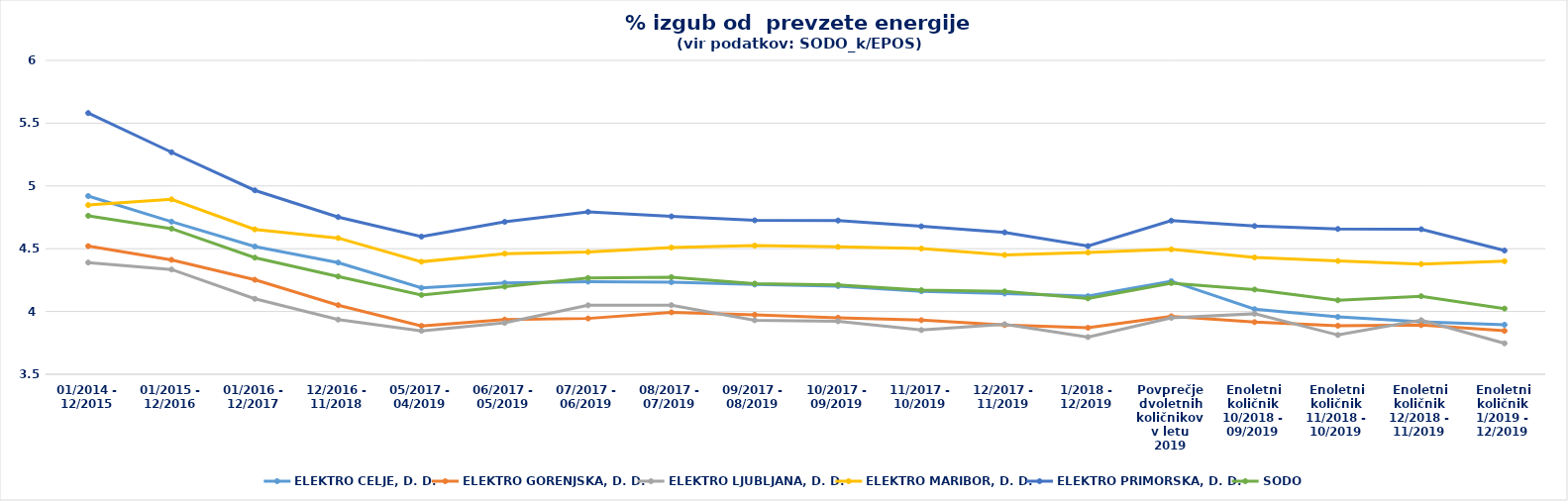
| Category | ELEKTRO CELJE, D. D. | ELEKTRO GORENJSKA, D. D. | ELEKTRO LJUBLJANA, D. D. | ELEKTRO MARIBOR, D. D. | ELEKTRO PRIMORSKA, D. D. | SODO |
|---|---|---|---|---|---|---|
| 01/2014 - 12/2015 | 4.92 | 4.521 | 4.39 | 4.848 | 5.581 | 4.762 |
| 01/2015 - 12/2016 | 4.716 | 4.411 | 4.334 | 4.893 | 5.268 | 4.66 |
| 01/2016 - 12/2017 | 4.518 | 4.253 | 4.101 | 4.654 | 4.965 | 4.429 |
| 12/2016 - 11/2018 | 4.39 | 4.051 | 3.936 | 4.585 | 4.752 | 4.279 |
| 05/2017 - 04/2019 | 4.188 | 3.885 | 3.846 | 4.396 | 4.597 | 4.132 |
| 06/2017 - 05/2019 | 4.228 | 3.936 | 3.909 | 4.461 | 4.714 | 4.198 |
| 07/2017 - 06/2019 | 4.237 | 3.945 | 4.049 | 4.474 | 4.794 | 4.267 |
| 08/2017 - 07/2019 | 4.233 | 3.993 | 4.051 | 4.509 | 4.758 | 4.274 |
| 09/2017 - 08/2019 | 4.215 | 3.974 | 3.93 | 4.525 | 4.726 | 4.222 |
| 10/2017 - 09/2019 | 4.203 | 3.95 | 3.923 | 4.515 | 4.724 | 4.212 |
| 11/2017 - 10/2019 | 4.161 | 3.931 | 3.852 | 4.501 | 4.678 | 4.17 |
| 12/2017 - 11/2019 | 4.143 | 3.892 | 3.899 | 4.45 | 4.63 | 4.16 |
| 1/2018 - 12/2019 | 4.123 | 3.871 | 3.796 | 4.47 | 4.521 | 4.104 |
| Povprečje dvoletnih količnikov v letu 2019 | 4.242 | 3.962 | 3.949 | 4.495 | 4.723 | 4.226 |
| Enoletni količnik 10/2018 - 09/2019 | 4.018 | 3.915 | 3.982 | 4.431 | 4.68 | 4.175 |
| Enoletni količnik 11/2018 - 10/2019 | 3.957 | 3.887 | 3.813 | 4.402 | 4.657 | 4.089 |
| Enoletni količnik 12/2018 - 11/2019 | 3.919 | 3.892 | 3.931 | 4.378 | 4.655 | 4.122 |
| Enoletni količnik 1/2019 - 12/2019 | 3.894 | 3.846 | 3.746 | 4.4 | 4.485 | 4.023 |